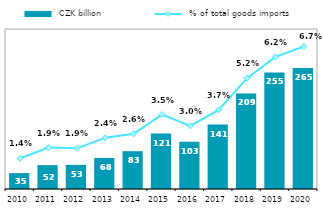
| Category |  CZK billion |
|---|---|
| 2010.0 | 34.751 |
| 2011.0 | 52.182 |
| 2012.0 | 52.758 |
| 2013.0 | 67.707 |
| 2014.0 | 82.719 |
| 2015.0 | 121.222 |
| 2016.0 | 103.219 |
| 2017.0 | 141.049 |
| 2018.0 | 209.053 |
| 2019.0 | 255.061 |
| 2020.0 | 264.728 |